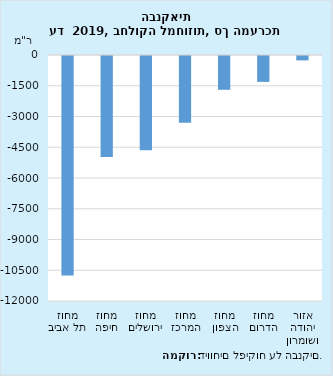
| Category | סך שטח הסניפים שנסגרו |
|---|---|
| מחוז תל אביב | -10703 |
| מחוז חיפה | -4929 |
| מחוז ירושלים | -4603 |
| מחוז המרכז | -3255 |
| מחוז הצפון | -1648 |
| מחוז הדרום | -1263 |
| אזור יהודה ושומרון | -214 |